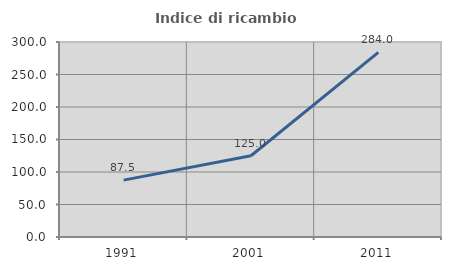
| Category | Indice di ricambio occupazionale  |
|---|---|
| 1991.0 | 87.5 |
| 2001.0 | 125 |
| 2011.0 | 283.969 |